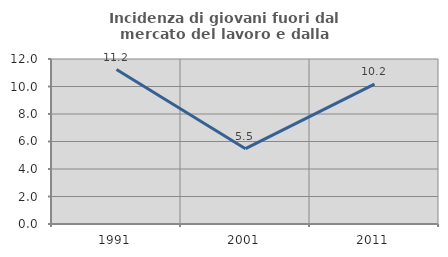
| Category | Incidenza di giovani fuori dal mercato del lavoro e dalla formazione  |
|---|---|
| 1991.0 | 11.236 |
| 2001.0 | 5.479 |
| 2011.0 | 10.169 |